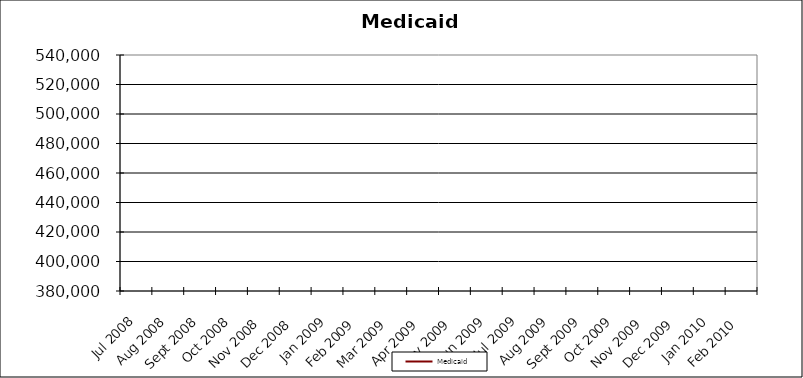
| Category | Medicaid |
|---|---|
| 2008-07-01 | 0 |
| 2008-08-01 | 0 |
| 2008-09-01 | 0 |
| 2008-10-01 | 0 |
| 2008-11-01 | 0 |
| 2008-12-01 | 0 |
| 2009-01-01 | 0 |
| 2009-02-01 | 0 |
| 2009-03-01 | 0 |
| 2009-04-01 | 0 |
| 2009-05-01 | 0 |
| 2009-06-01 | 0 |
| 2009-07-01 | 0 |
| 2009-08-01 | 0 |
| 2009-09-01 | 0 |
| 2009-10-01 | 0 |
| 2009-11-01 | 0 |
| 2009-12-01 | 0 |
| 2010-01-01 | 0 |
| 2010-02-01 | 0 |